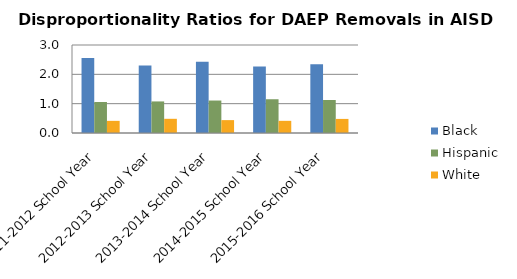
| Category | Black | Hispanic | White |
|---|---|---|---|
| 2011-2012 School Year | 2.56 | 1.057 | 0.414 |
| 2012-2013 School Year | 2.299 | 1.076 | 0.484 |
| 2013-2014 School Year | 2.431 | 1.107 | 0.439 |
| 2014-2015 School Year | 2.27 | 1.151 | 0.414 |
| 2015-2016 School Year | 2.34 | 1.125 | 0.48 |